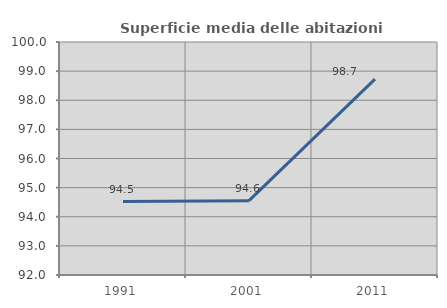
| Category | Superficie media delle abitazioni occupate |
|---|---|
| 1991.0 | 94.523 |
| 2001.0 | 94.552 |
| 2011.0 | 98.727 |